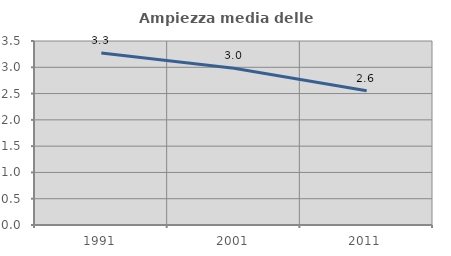
| Category | Ampiezza media delle famiglie |
|---|---|
| 1991.0 | 3.272 |
| 2001.0 | 2.982 |
| 2011.0 | 2.553 |